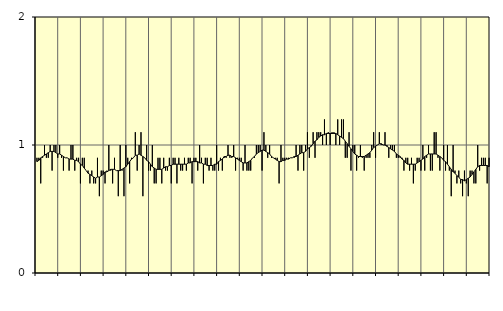
| Category | Jordbruk, skogsbruk o fiske, SNI 01-03 | Series 1 |
|---|---|---|
| nan | 0.9 | 0.87 |
| 1.0 | 0.9 | 0.88 |
| 1.0 | 0.7 | 0.9 |
| 1.0 | 0.9 | 0.91 |
| 1.0 | 1 | 0.92 |
| 1.0 | 0.9 | 0.93 |
| 1.0 | 0.9 | 0.94 |
| 1.0 | 1 | 0.95 |
| 1.0 | 0.8 | 0.95 |
| 1.0 | 1 | 0.95 |
| 1.0 | 1 | 0.94 |
| 1.0 | 0.9 | 0.93 |
| nan | 1 | 0.93 |
| 2.0 | 0.9 | 0.92 |
| 2.0 | 0.8 | 0.91 |
| 2.0 | 0.9 | 0.9 |
| 2.0 | 0.9 | 0.9 |
| 2.0 | 0.8 | 0.89 |
| 2.0 | 1 | 0.89 |
| 2.0 | 1 | 0.89 |
| 2.0 | 0.8 | 0.88 |
| 2.0 | 0.9 | 0.88 |
| 2.0 | 0.9 | 0.87 |
| 2.0 | 0.7 | 0.85 |
| nan | 0.9 | 0.84 |
| 3.0 | 0.9 | 0.82 |
| 3.0 | 0.8 | 0.8 |
| 3.0 | 0.8 | 0.78 |
| 3.0 | 0.7 | 0.77 |
| 3.0 | 0.8 | 0.76 |
| 3.0 | 0.7 | 0.75 |
| 3.0 | 0.7 | 0.74 |
| 3.0 | 0.9 | 0.75 |
| 3.0 | 0.6 | 0.75 |
| 3.0 | 0.8 | 0.76 |
| 3.0 | 0.8 | 0.77 |
| nan | 0.7 | 0.79 |
| 4.0 | 0.8 | 0.79 |
| 4.0 | 1 | 0.8 |
| 4.0 | 0.8 | 0.81 |
| 4.0 | 0.7 | 0.81 |
| 4.0 | 0.9 | 0.81 |
| 4.0 | 0.8 | 0.8 |
| 4.0 | 0.6 | 0.8 |
| 4.0 | 1 | 0.8 |
| 4.0 | 0.8 | 0.81 |
| 4.0 | 0.6 | 0.82 |
| 4.0 | 1 | 0.83 |
| nan | 0.9 | 0.85 |
| 5.0 | 0.7 | 0.87 |
| 5.0 | 0.9 | 0.89 |
| 5.0 | 0.9 | 0.9 |
| 5.0 | 1.1 | 0.92 |
| 5.0 | 0.8 | 0.92 |
| 5.0 | 1 | 0.93 |
| 5.0 | 1.1 | 0.92 |
| 5.0 | 0.6 | 0.91 |
| 5.0 | 0.9 | 0.9 |
| 5.0 | 1 | 0.88 |
| 5.0 | 0.8 | 0.87 |
| nan | 0.8 | 0.85 |
| 6.0 | 1 | 0.83 |
| 6.0 | 0.7 | 0.82 |
| 6.0 | 0.7 | 0.81 |
| 6.0 | 0.9 | 0.81 |
| 6.0 | 0.9 | 0.81 |
| 6.0 | 0.7 | 0.81 |
| 6.0 | 0.9 | 0.82 |
| 6.0 | 0.8 | 0.83 |
| 6.0 | 0.8 | 0.83 |
| 6.0 | 0.9 | 0.84 |
| 6.0 | 0.7 | 0.84 |
| nan | 0.9 | 0.85 |
| 7.0 | 0.9 | 0.85 |
| 7.0 | 0.7 | 0.85 |
| 7.0 | 0.9 | 0.85 |
| 7.0 | 0.8 | 0.85 |
| 7.0 | 0.8 | 0.85 |
| 7.0 | 0.9 | 0.85 |
| 7.0 | 0.8 | 0.85 |
| 7.0 | 0.9 | 0.86 |
| 7.0 | 0.9 | 0.86 |
| 7.0 | 0.7 | 0.87 |
| 7.0 | 0.9 | 0.87 |
| nan | 0.9 | 0.87 |
| 8.0 | 0.8 | 0.87 |
| 8.0 | 1 | 0.86 |
| 8.0 | 0.9 | 0.86 |
| 8.0 | 0.7 | 0.85 |
| 8.0 | 0.9 | 0.85 |
| 8.0 | 0.9 | 0.84 |
| 8.0 | 0.8 | 0.84 |
| 8.0 | 0.9 | 0.84 |
| 8.0 | 0.8 | 0.84 |
| 8.0 | 0.8 | 0.85 |
| 8.0 | 1 | 0.85 |
| nan | 0.8 | 0.87 |
| 9.0 | 0.9 | 0.88 |
| 9.0 | 0.8 | 0.89 |
| 9.0 | 0.9 | 0.91 |
| 9.0 | 0.9 | 0.91 |
| 9.0 | 1 | 0.92 |
| 9.0 | 0.9 | 0.92 |
| 9.0 | 0.9 | 0.91 |
| 9.0 | 1 | 0.91 |
| 9.0 | 0.8 | 0.9 |
| 9.0 | 0.9 | 0.89 |
| 9.0 | 0.9 | 0.88 |
| nan | 0.9 | 0.87 |
| 10.0 | 0.8 | 0.86 |
| 10.0 | 1 | 0.86 |
| 10.0 | 0.8 | 0.86 |
| 10.0 | 0.8 | 0.87 |
| 10.0 | 0.8 | 0.88 |
| 10.0 | 0.9 | 0.9 |
| 10.0 | 0.9 | 0.91 |
| 10.0 | 1 | 0.93 |
| 10.0 | 1 | 0.94 |
| 10.0 | 1 | 0.95 |
| 10.0 | 0.8 | 0.96 |
| nan | 1.1 | 0.96 |
| 11.0 | 1 | 0.95 |
| 11.0 | 0.9 | 0.94 |
| 11.0 | 1 | 0.93 |
| 11.0 | 0.9 | 0.91 |
| 11.0 | 0.9 | 0.9 |
| 11.0 | 0.9 | 0.89 |
| 11.0 | 0.9 | 0.88 |
| 11.0 | 0.7 | 0.87 |
| 11.0 | 1 | 0.87 |
| 11.0 | 0.9 | 0.88 |
| 11.0 | 0.9 | 0.88 |
| nan | 0.9 | 0.89 |
| 12.0 | 0.9 | 0.89 |
| 12.0 | 0.9 | 0.9 |
| 12.0 | 0.9 | 0.9 |
| 12.0 | 0.9 | 0.91 |
| 12.0 | 1 | 0.91 |
| 12.0 | 0.8 | 0.92 |
| 12.0 | 1 | 0.93 |
| 12.0 | 1 | 0.94 |
| 12.0 | 0.8 | 0.94 |
| 12.0 | 1 | 0.95 |
| 12.0 | 1.1 | 0.97 |
| nan | 0.9 | 0.98 |
| 13.0 | 1 | 0.99 |
| 13.0 | 1.1 | 1.01 |
| 13.0 | 0.9 | 1.03 |
| 13.0 | 1.1 | 1.04 |
| 13.0 | 1.1 | 1.06 |
| 13.0 | 1.1 | 1.07 |
| 13.0 | 1 | 1.08 |
| 13.0 | 1.2 | 1.08 |
| 13.0 | 1 | 1.09 |
| 13.0 | 1.1 | 1.09 |
| 13.0 | 1 | 1.09 |
| nan | 1.1 | 1.09 |
| 14.0 | 1.1 | 1.09 |
| 14.0 | 1 | 1.09 |
| 14.0 | 1.2 | 1.08 |
| 14.0 | 1 | 1.07 |
| 14.0 | 1.2 | 1.06 |
| 14.0 | 1.2 | 1.05 |
| 14.0 | 0.9 | 1.03 |
| 14.0 | 0.9 | 1.01 |
| 14.0 | 1.1 | 0.99 |
| 14.0 | 0.8 | 0.97 |
| 14.0 | 1 | 0.95 |
| nan | 1 | 0.93 |
| 15.0 | 0.8 | 0.92 |
| 15.0 | 0.9 | 0.91 |
| 15.0 | 1 | 0.91 |
| 15.0 | 0.9 | 0.91 |
| 15.0 | 0.8 | 0.91 |
| 15.0 | 0.9 | 0.92 |
| 15.0 | 0.9 | 0.93 |
| 15.0 | 0.9 | 0.94 |
| 15.0 | 1 | 0.96 |
| 15.0 | 1.1 | 0.98 |
| 15.0 | 0.9 | 0.99 |
| nan | 1 | 1 |
| 16.0 | 1.1 | 1.01 |
| 16.0 | 1 | 1.01 |
| 16.0 | 1 | 1 |
| 16.0 | 1.1 | 1 |
| 16.0 | 1 | 0.99 |
| 16.0 | 0.9 | 0.98 |
| 16.0 | 1 | 0.97 |
| 16.0 | 1 | 0.96 |
| 16.0 | 1 | 0.95 |
| 16.0 | 0.9 | 0.93 |
| 16.0 | 0.9 | 0.92 |
| nan | 0.9 | 0.91 |
| 17.0 | 0.9 | 0.89 |
| 17.0 | 0.8 | 0.88 |
| 17.0 | 0.9 | 0.86 |
| 17.0 | 0.9 | 0.85 |
| 17.0 | 0.8 | 0.85 |
| 17.0 | 0.9 | 0.85 |
| 17.0 | 0.7 | 0.85 |
| 17.0 | 0.8 | 0.85 |
| 17.0 | 0.9 | 0.86 |
| 17.0 | 0.9 | 0.87 |
| 17.0 | 0.8 | 0.88 |
| nan | 1 | 0.89 |
| 18.0 | 0.8 | 0.91 |
| 18.0 | 0.9 | 0.92 |
| 18.0 | 1 | 0.93 |
| 18.0 | 0.8 | 0.93 |
| 18.0 | 0.8 | 0.93 |
| 18.0 | 1.1 | 0.93 |
| 18.0 | 1.1 | 0.93 |
| 18.0 | 0.9 | 0.92 |
| 18.0 | 0.8 | 0.91 |
| 18.0 | 0.9 | 0.9 |
| 18.0 | 1 | 0.88 |
| nan | 0.8 | 0.87 |
| 19.0 | 1 | 0.85 |
| 19.0 | 0.8 | 0.83 |
| 19.0 | 0.6 | 0.81 |
| 19.0 | 1 | 0.79 |
| 19.0 | 0.8 | 0.78 |
| 19.0 | 0.7 | 0.76 |
| 19.0 | 0.8 | 0.75 |
| 19.0 | 0.7 | 0.73 |
| 19.0 | 0.6 | 0.73 |
| 19.0 | 0.8 | 0.72 |
| 19.0 | 0.7 | 0.73 |
| nan | 0.6 | 0.74 |
| 20.0 | 0.8 | 0.75 |
| 20.0 | 0.8 | 0.77 |
| 20.0 | 0.7 | 0.79 |
| 20.0 | 0.7 | 0.81 |
| 20.0 | 1 | 0.83 |
| 20.0 | 0.8 | 0.84 |
| 20.0 | 0.9 | 0.84 |
| 20.0 | 0.9 | 0.84 |
| 20.0 | 0.9 | 0.84 |
| 20.0 | 0.7 | 0.84 |
| 20.0 | 0.9 | 0.83 |